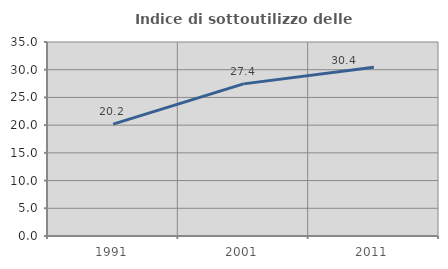
| Category | Indice di sottoutilizzo delle abitazioni  |
|---|---|
| 1991.0 | 20.192 |
| 2001.0 | 27.444 |
| 2011.0 | 30.425 |